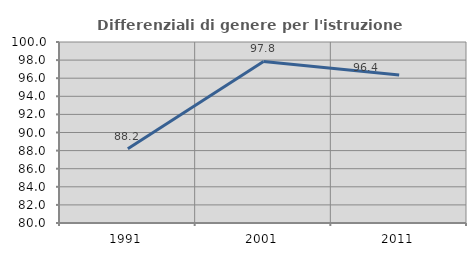
| Category | Differenziali di genere per l'istruzione superiore |
|---|---|
| 1991.0 | 88.196 |
| 2001.0 | 97.847 |
| 2011.0 | 96.361 |